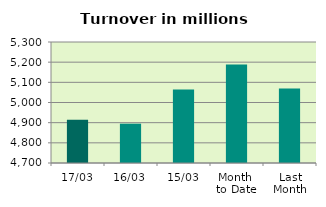
| Category | Series 0 |
|---|---|
| 17/03 | 4914.021 |
| 16/03 | 4894.95 |
| 15/03 | 5064.6 |
| Month 
to Date | 5188.653 |
| Last
Month | 5069.383 |